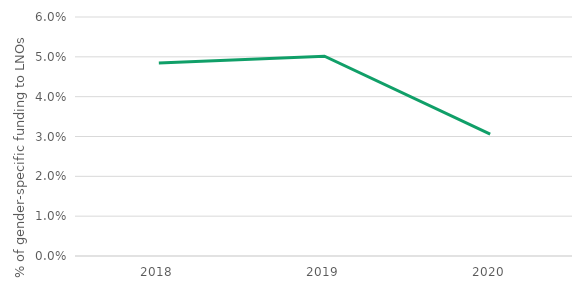
| Category | Proportion of gender specific funding to LNOs |
|---|---|
| 2018.0 | 0.048 |
| 2019.0 | 0.05 |
| 2020.0 | 0.031 |